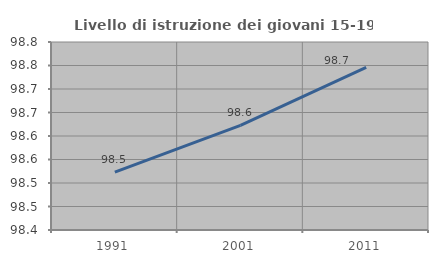
| Category | Livello di istruzione dei giovani 15-19 anni |
|---|---|
| 1991.0 | 98.523 |
| 2001.0 | 98.623 |
| 2011.0 | 98.746 |